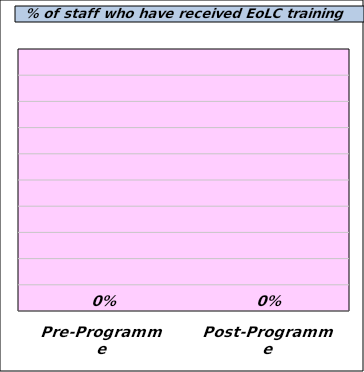
| Category | Series 0 |
|---|---|
| Pre-Programme | 0 |
| Post-Programme | 0 |